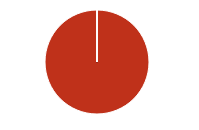
| Category | Total |
|---|---|
| Y | 0 |
| R | 0 |
| T | 0 |
| M | 0 |
| F | 0 |
| N | 32 |